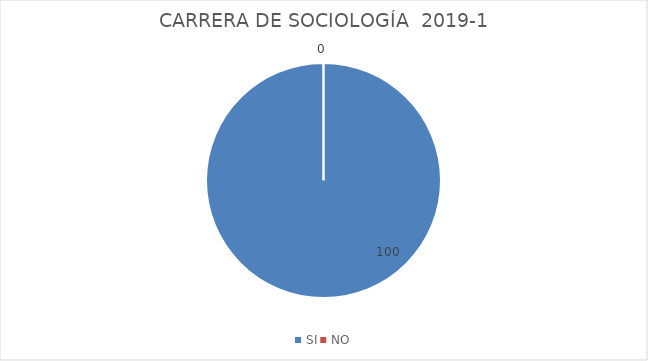
| Category | Series 0 |
|---|---|
| SI | 100 |
| NO | 0 |